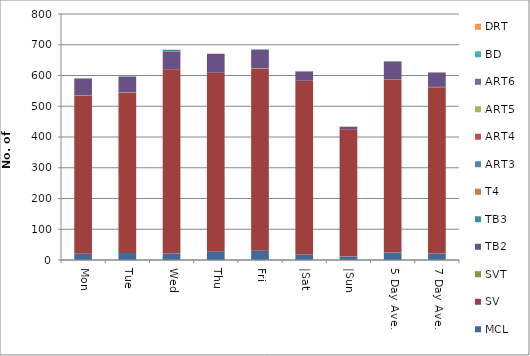
| Category | MCL | SV | SVT | TB2 | TB3 | T4 | ART3 | ART4 | ART5 | ART6 | BD | DRT |
|---|---|---|---|---|---|---|---|---|---|---|---|---|
| Mon | 20 | 515 | 1 | 53 | 1 | 1 | 1 | 0 | 0 | 0 | 0 | 0 |
| Tue | 23 | 521 | 1 | 51 | 1 | 1 | 0 | 0 | 0 | 0 | 0 | 0 |
| Wed | 21 | 599 | 0 | 58 | 5 | 1 | 0 | 0 | 0 | 0 | 0 | 0 |
| Thu | 27 | 582 | 0 | 61 | 0 | 0 | 0 | 1 | 0 | 0 | 0 | 0 |
| Fri | 30 | 592 | 2 | 60 | 1 | 0 | 0 | 0 | 0 | 0 | 0 | 0 |
| |Sat | 18 | 565 | 0 | 30 | 1 | 0 | 0 | 0 | 0 | 0 | 0 | 0 |
| |Sun | 11 | 414 | 0 | 8 | 0 | 1 | 0 | 0 | 0 | 0 | 0 | 0 |
| 5 Day Ave. | 24 | 562 | 1 | 57 | 2 | 1 | 0 | 0 | 0 | 0 | 0 | 0 |
| 7 Day Ave. | 21 | 541 | 1 | 46 | 1 | 1 | 0 | 0 | 0 | 0 | 0 | 0 |